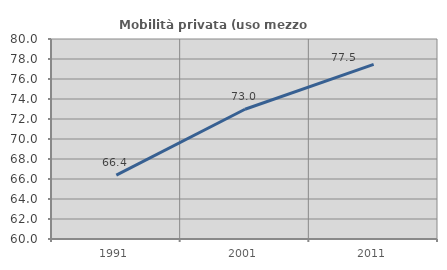
| Category | Mobilità privata (uso mezzo privato) |
|---|---|
| 1991.0 | 66.394 |
| 2001.0 | 72.973 |
| 2011.0 | 77.466 |